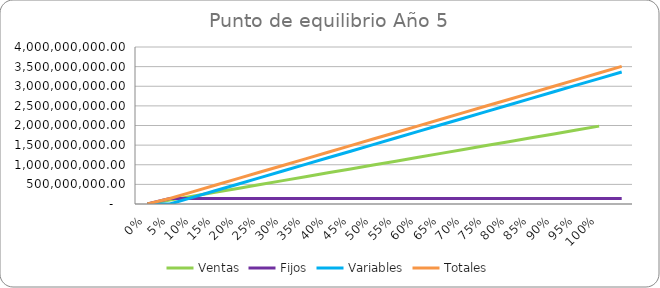
| Category | Ventas | Fijos | Variables | Totales |
|---|---|---|---|---|
| 0.0 | 0 | 0 | 0 | 0 |
| 0.05 | 99225000 | 141402955.797 | 0 | 141402955.797 |
| 0.1 | 198450000 | 141402955.797 | 168177460.289 | 309580416.086 |
| 0.15 | 297675000 | 141402955.797 | 336354920.578 | 477757876.375 |
| 0.2 | 396900000 | 141402955.797 | 504532380.867 | 645935336.664 |
| 0.25 | 496125000 | 141402955.797 | 672709841.156 | 814112796.953 |
| 0.3 | 595350000 | 141402955.797 | 840887301.446 | 982290257.242 |
| 0.35 | 694575000 | 141402955.797 | 1009064761.735 | 1150467717.531 |
| 0.4 | 793800000 | 141402955.797 | 1177242222.024 | 1318645177.82 |
| 0.45 | 893025000 | 141402955.797 | 1345419682.313 | 1486822638.11 |
| 0.5 | 992250000 | 141402955.797 | 1513597142.602 | 1655000098.399 |
| 0.55 | 1091475000 | 141402955.797 | 1681774602.891 | 1823177558.688 |
| 0.6 | 1190700000 | 141402955.797 | 1849952063.18 | 1991355018.977 |
| 0.65 | 1289925000 | 141402955.797 | 2018129523.469 | 2159532479.266 |
| 0.7 | 1389150000 | 141402955.797 | 2186306983.758 | 2327709939.555 |
| 0.75 | 1488375000 | 141402955.797 | 2354484444.048 | 2495887399.844 |
| 0.8 | 1587600000 | 141402955.797 | 2522661904.337 | 2664064860.133 |
| 0.85 | 1686825000 | 141402955.797 | 2690839364.626 | 2832242320.422 |
| 0.9 | 1786050000 | 141402955.797 | 2859016824.915 | 3000419780.712 |
| 0.95 | 1885275000 | 141402955.797 | 3027194285.204 | 3168597241.001 |
| 1.0 | 1984500000 | 141402955.797 | 3195371745.493 | 3336774701.29 |